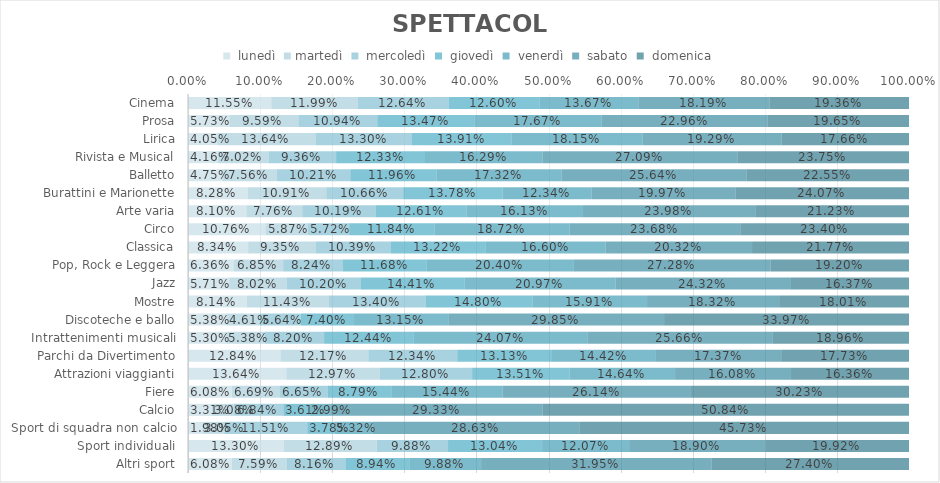
| Category |  lunedì | martedì |  mercoledì |  giovedì |  venerdì |  sabato |  domenica |
|---|---|---|---|---|---|---|---|
| Cinema | 0.116 | 0.12 | 0.126 | 0.126 | 0.137 | 0.182 | 0.194 |
| Prosa | 0.057 | 0.096 | 0.109 | 0.135 | 0.177 | 0.23 | 0.196 |
| Lirica | 0.041 | 0.136 | 0.133 | 0.139 | 0.182 | 0.193 | 0.177 |
| Rivista e Musical | 0.042 | 0.07 | 0.094 | 0.123 | 0.163 | 0.271 | 0.237 |
| Balletto | 0.048 | 0.076 | 0.102 | 0.12 | 0.173 | 0.256 | 0.226 |
| Burattini e Marionette | 0.083 | 0.109 | 0.107 | 0.138 | 0.123 | 0.2 | 0.241 |
| Arte varia | 0.081 | 0.078 | 0.102 | 0.126 | 0.161 | 0.24 | 0.212 |
| Circo | 0.108 | 0.059 | 0.057 | 0.118 | 0.187 | 0.237 | 0.234 |
| Classica | 0.083 | 0.094 | 0.104 | 0.132 | 0.166 | 0.203 | 0.218 |
| Pop, Rock e Leggera | 0.064 | 0.068 | 0.082 | 0.117 | 0.204 | 0.273 | 0.192 |
| Jazz | 0.057 | 0.08 | 0.102 | 0.144 | 0.21 | 0.243 | 0.164 |
| Mostre | 0.081 | 0.114 | 0.134 | 0.148 | 0.159 | 0.183 | 0.18 |
| Discoteche e ballo | 0.054 | 0.046 | 0.056 | 0.074 | 0.132 | 0.298 | 0.34 |
| Intrattenimenti musicali | 0.053 | 0.054 | 0.082 | 0.124 | 0.241 | 0.257 | 0.19 |
| Parchi da Divertimento | 0.128 | 0.122 | 0.123 | 0.131 | 0.144 | 0.174 | 0.177 |
| Attrazioni viaggianti | 0.136 | 0.13 | 0.128 | 0.135 | 0.146 | 0.161 | 0.164 |
| Fiere | 0.061 | 0.067 | 0.066 | 0.088 | 0.154 | 0.261 | 0.302 |
| Calcio | 0.033 | 0.031 | 0.068 | 0.036 | 0.03 | 0.293 | 0.508 |
| Sport di squadra non calcio | 0.02 | 0.03 | 0.115 | 0.038 | 0.053 | 0.286 | 0.457 |
| Sport individuali | 0.133 | 0.129 | 0.099 | 0.13 | 0.121 | 0.189 | 0.199 |
| Altri sport | 0.061 | 0.076 | 0.082 | 0.089 | 0.099 | 0.319 | 0.274 |